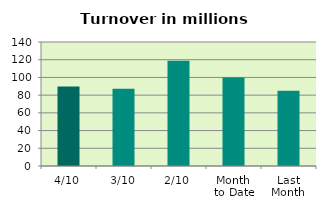
| Category | Series 0 |
|---|---|
| 4/10 | 89.735 |
| 3/10 | 87.094 |
| 2/10 | 118.926 |
| Month 
to Date | 99.864 |
| Last
Month | 85.072 |